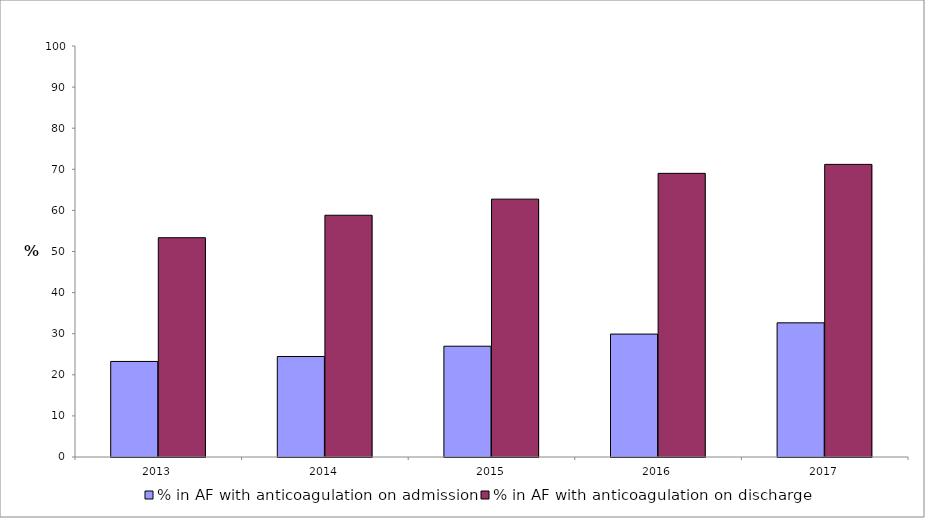
| Category | % in AF with anticoagulation on admission | % in AF with anticoagulation on discharge |
|---|---|---|
| 2013.0 | 23.249 | 53.356 |
| 2014.0 | 24.453 | 58.824 |
| 2015.0 | 26.957 | 62.741 |
| 2016.0 | 29.906 | 69.014 |
| 2017.0 | 32.642 | 71.198 |